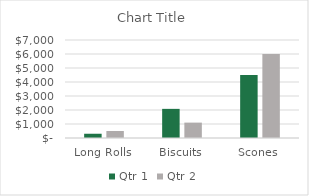
| Category | Qtr 1 | Qtr 2 |
|---|---|---|
| Long Rolls | 304.03 | 502.01 |
| Biscuits | 2080.83 | 1099.2 |
| Scones | 4504.42 | 6003.2 |